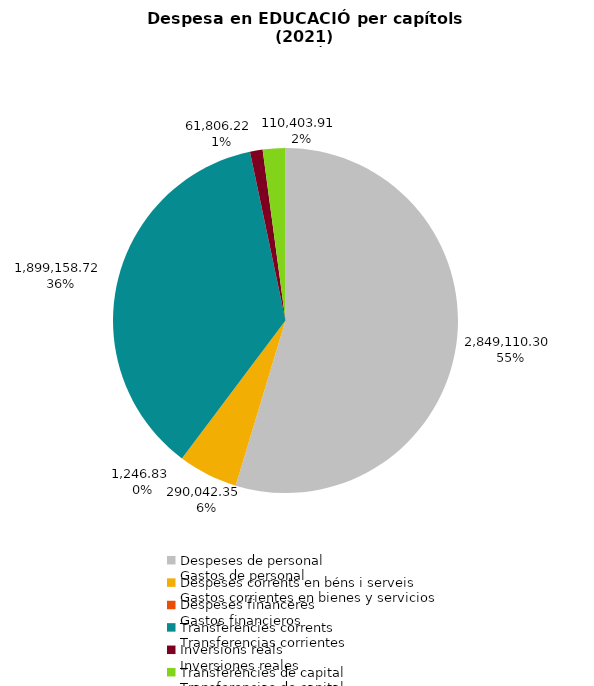
| Category | Series 0 |
|---|---|
| Despeses de personal
Gastos de personal | 2849110.3 |
| Despeses corrents en béns i serveis
Gastos corrientes en bienes y servicios | 290042.35 |
| Despeses financeres
Gastos financieros | 1246.83 |
| Transferències corrents
Transferencias corrientes | 1899158.72 |
| Inversions reals
Inversiones reales | 61806.22 |
| Transferències de capital
Transferencias de capital | 110403.91 |